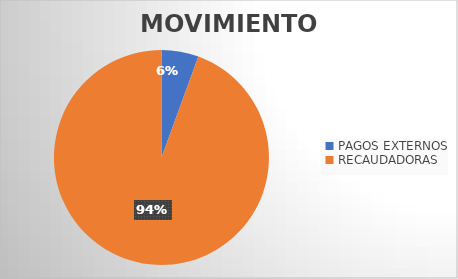
| Category | MOVIMIENTOS |
|---|---|
| PAGOS EXTERNOS | 1352 |
| RECAUDADORAS | 22910 |